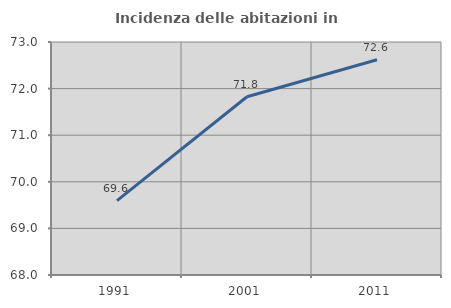
| Category | Incidenza delle abitazioni in proprietà  |
|---|---|
| 1991.0 | 69.597 |
| 2001.0 | 71.825 |
| 2011.0 | 72.618 |